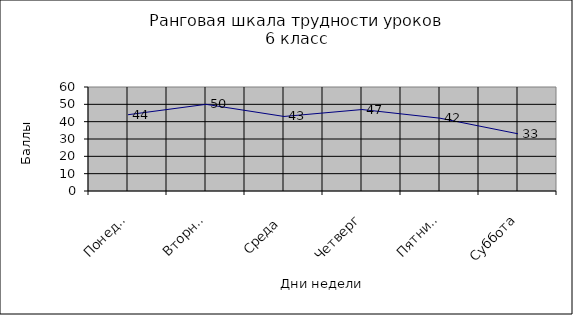
| Category | Series 0 |
|---|---|
| Понедельник | 44 |
| Вторник | 50 |
| Среда | 43 |
| Четверг | 47 |
| Пятница | 42 |
| Суббота | 33 |